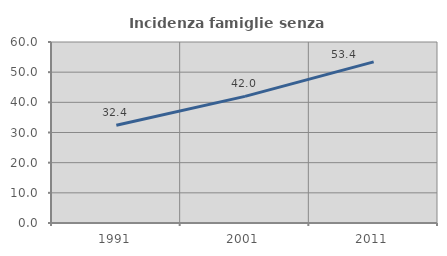
| Category | Incidenza famiglie senza nuclei |
|---|---|
| 1991.0 | 32.416 |
| 2001.0 | 41.975 |
| 2011.0 | 53.42 |